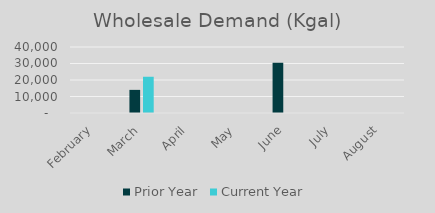
| Category | Prior Year | Current Year |
|---|---|---|
| February | 0 | 0 |
| March | 14013.78 | 21965.02 |
| April | 0 | 0 |
| May | 0 | 0 |
| June | 30443.6 | 0 |
| July | 0 | 0 |
| August | 0 | 0 |